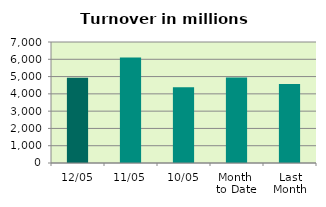
| Category | Series 0 |
|---|---|
| 12/05 | 4927.212 |
| 11/05 | 6102.53 |
| 10/05 | 4388.737 |
| Month 
to Date | 4945.332 |
| Last
Month | 4573.802 |